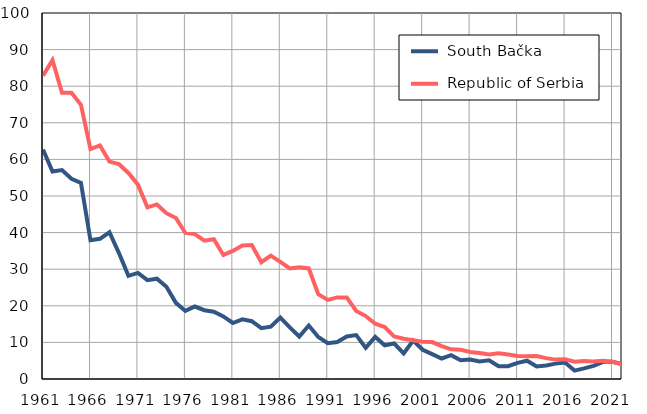
| Category |  South Bačka |  Republic of Serbia |
|---|---|---|
| 1961.0 | 62.7 | 82.9 |
| 1962.0 | 56.7 | 87.1 |
| 1963.0 | 57.1 | 78.2 |
| 1964.0 | 54.7 | 78.2 |
| 1965.0 | 53.6 | 74.9 |
| 1966.0 | 37.9 | 62.8 |
| 1967.0 | 38.3 | 63.8 |
| 1968.0 | 40.1 | 59.4 |
| 1969.0 | 34.4 | 58.7 |
| 1970.0 | 28.2 | 56.3 |
| 1971.0 | 29 | 53.1 |
| 1972.0 | 27 | 46.9 |
| 1973.0 | 27.4 | 47.7 |
| 1974.0 | 25.2 | 45.3 |
| 1975.0 | 20.8 | 44 |
| 1976.0 | 18.6 | 39.9 |
| 1977.0 | 19.8 | 39.6 |
| 1978.0 | 18.8 | 37.8 |
| 1979.0 | 18.4 | 38.2 |
| 1980.0 | 17.1 | 33.9 |
| 1981.0 | 15.3 | 35 |
| 1982.0 | 16.3 | 36.5 |
| 1983.0 | 15.8 | 36.6 |
| 1984.0 | 13.9 | 31.9 |
| 1985.0 | 14.3 | 33.7 |
| 1986.0 | 16.8 | 32 |
| 1987.0 | 14.1 | 30.2 |
| 1988.0 | 11.6 | 30.5 |
| 1989.0 | 14.6 | 30.2 |
| 1990.0 | 11.5 | 23.2 |
| 1991.0 | 9.8 | 21.6 |
| 1992.0 | 10.1 | 22.3 |
| 1993.0 | 11.6 | 22.3 |
| 1994.0 | 12 | 18.6 |
| 1995.0 | 8.5 | 17.2 |
| 1996.0 | 11.5 | 15.1 |
| 1997.0 | 9.2 | 14.2 |
| 1998.0 | 9.7 | 11.6 |
| 1999.0 | 7 | 11 |
| 2000.0 | 10.5 | 10.6 |
| 2001.0 | 8 | 10.2 |
| 2002.0 | 6.8 | 10.1 |
| 2003.0 | 5.6 | 9 |
| 2004.0 | 6.5 | 8.1 |
| 2005.0 | 5.1 | 8 |
| 2006.0 | 5.3 | 7.4 |
| 2007.0 | 4.8 | 7.1 |
| 2008.0 | 5.1 | 6.7 |
| 2009.0 | 3.5 | 7 |
| 2010.0 | 3.5 | 6.7 |
| 2011.0 | 4.4 | 6.3 |
| 2012.0 | 5 | 6.2 |
| 2013.0 | 3.4 | 6.3 |
| 2014.0 | 3.7 | 5.7 |
| 2015.0 | 4.2 | 5.3 |
| 2016.0 | 4.5 | 5.4 |
| 2017.0 | 2.3 | 4.7 |
| 2018.0 | 2.9 | 4.9 |
| 2019.0 | 3.6 | 4.8 |
| 2020.0 | 4.7 | 5 |
| 2021.0 | 4.7 | 4.7 |
| 2022.0 | 4.1 | 4 |